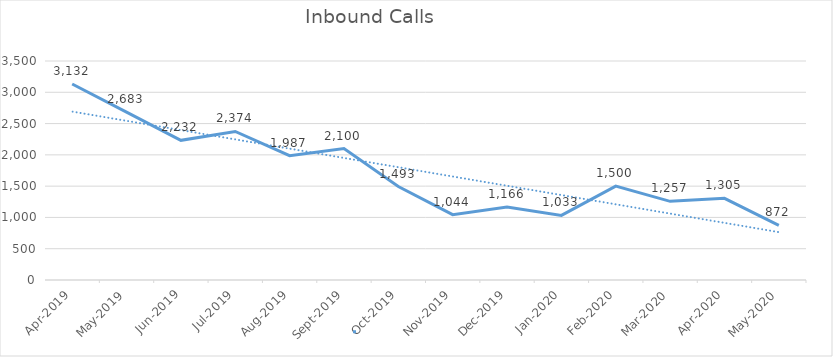
| Category | Inbound TOTAL |
|---|---|
| 2019-04-01 | 3132 |
| 2019-05-01 | 2683 |
| 2019-06-01 | 2232 |
| 2019-07-01 | 2374 |
| 2019-08-01 | 1987 |
| 2019-09-01 | 2100 |
| 2019-10-01 | 1493 |
| 2019-11-01 | 1044 |
| 2019-12-01 | 1166 |
| 2020-01-01 | 1033 |
| 2020-02-01 | 1500 |
| 2020-03-01 | 1257 |
| 2020-04-01 | 1305 |
| 2020-05-01 | 872 |